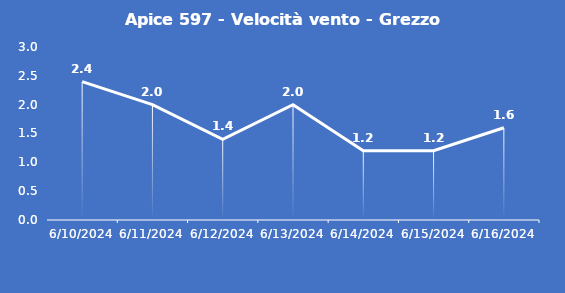
| Category | Apice 597 - Velocità vento - Grezzo (m/s) |
|---|---|
| 6/10/24 | 2.4 |
| 6/11/24 | 2 |
| 6/12/24 | 1.4 |
| 6/13/24 | 2 |
| 6/14/24 | 1.2 |
| 6/15/24 | 1.2 |
| 6/16/24 | 1.6 |